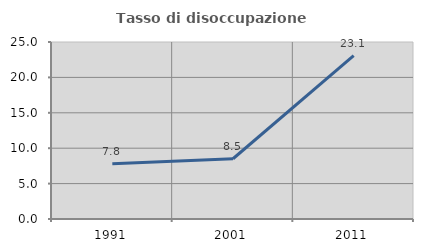
| Category | Tasso di disoccupazione giovanile  |
|---|---|
| 1991.0 | 7.812 |
| 2001.0 | 8.511 |
| 2011.0 | 23.077 |